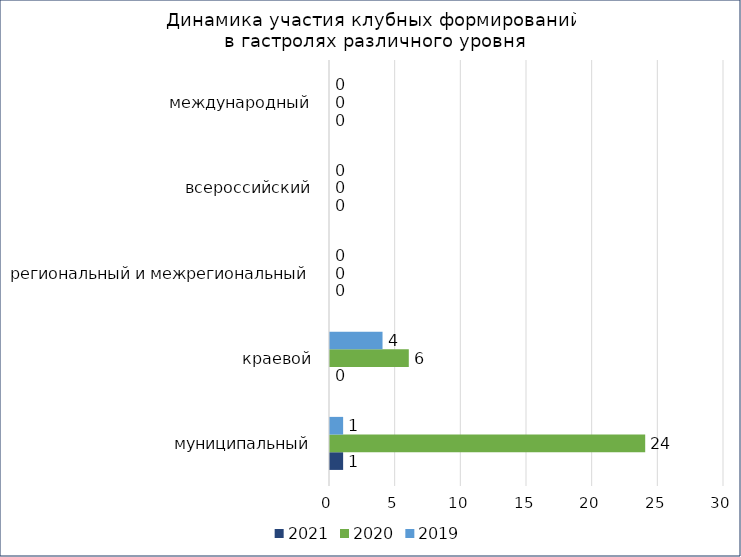
| Category | 2021 | 2020 | 2019 |
|---|---|---|---|
| муниципальный | 1 | 24 | 1 |
| краевой | 0 | 6 | 4 |
| региональный и межрегиональный | 0 | 0 | 0 |
| всероссийский | 0 | 0 | 0 |
| международный | 0 | 0 | 0 |